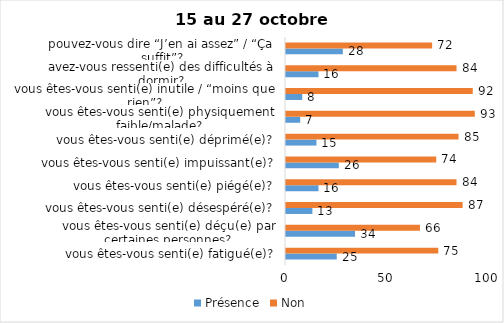
| Category | Présence | Non |
|---|---|---|
| vous êtes-vous senti(e) fatigué(e)? | 25 | 75 |
| vous êtes-vous senti(e) déçu(e) par certaines personnes? | 34 | 66 |
| vous êtes-vous senti(e) désespéré(e)? | 13 | 87 |
| vous êtes-vous senti(e) piégé(e)? | 16 | 84 |
| vous êtes-vous senti(e) impuissant(e)? | 26 | 74 |
| vous êtes-vous senti(e) déprimé(e)? | 15 | 85 |
| vous êtes-vous senti(e) physiquement faible/malade? | 7 | 93 |
| vous êtes-vous senti(e) inutile / “moins que rien”? | 8 | 92 |
| avez-vous ressenti(e) des difficultés à dormir? | 16 | 84 |
| pouvez-vous dire “J’en ai assez” / “Ça suffit”? | 28 | 72 |